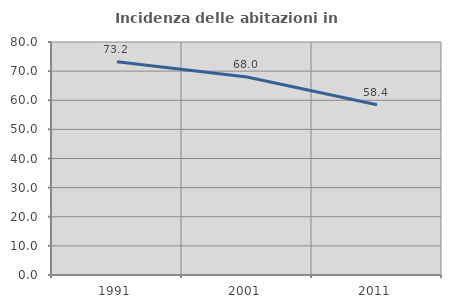
| Category | Incidenza delle abitazioni in proprietà  |
|---|---|
| 1991.0 | 73.186 |
| 2001.0 | 67.975 |
| 2011.0 | 58.445 |